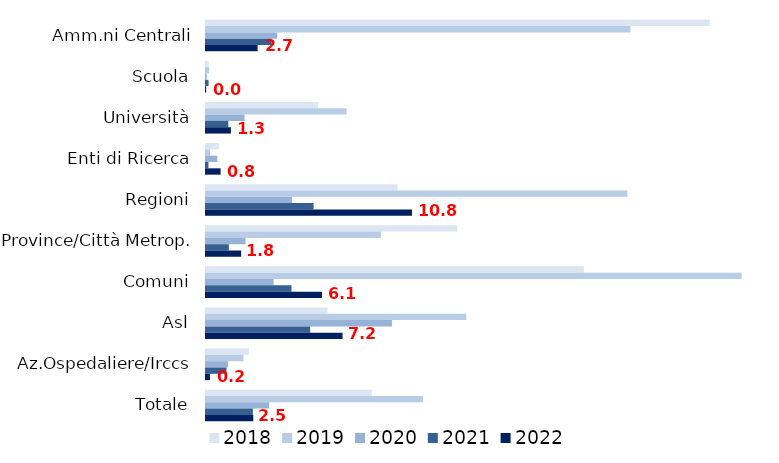
| Category | 2018 | 2019 | 2020 | 2021 | 2022 |
|---|---|---|---|---|---|
| Amm.ni Centrali | 26.422 | 22.26 | 3.734 | 3.445 | 2.705 |
| Scuola | 0.14 | 0.166 | 0.038 | 0.135 | 0.009 |
| Università | 5.877 | 7.372 | 2.023 | 1.17 | 1.307 |
| Enti di Ricerca | 0.675 | 0.207 | 0.593 | 0.127 | 0.767 |
| Regioni | 10.043 | 22.1 | 4.508 | 5.643 | 10.801 |
| Province/Città Metrop. | 13.181 | 9.167 | 2.072 | 1.199 | 1.844 |
| Comuni | 19.817 | 28.094 | 3.546 | 4.486 | 6.084 |
| Asl | 6.377 | 13.653 | 9.751 | 5.46 | 7.161 |
| Az.Ospedaliere/Irccs | 2.261 | 1.965 | 1.16 | 1.074 | 0.208 |
| Totale | 8.695 | 11.379 | 3.314 | 2.459 | 2.48 |